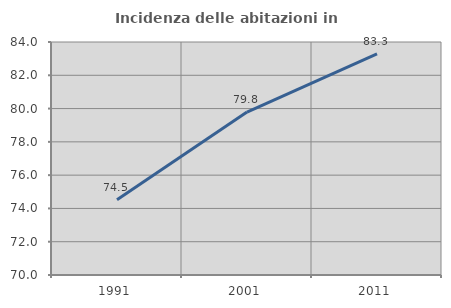
| Category | Incidenza delle abitazioni in proprietà  |
|---|---|
| 1991.0 | 74.528 |
| 2001.0 | 79.787 |
| 2011.0 | 83.291 |